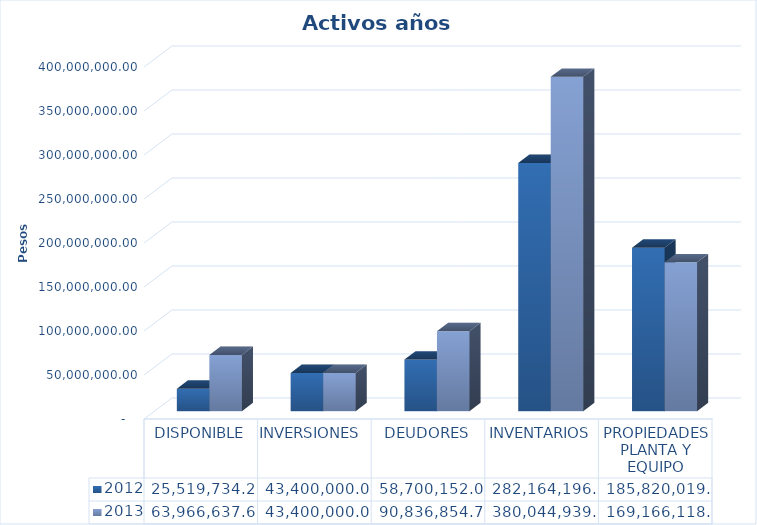
| Category | 2012 | 2013 |
|---|---|---|
| DISPONIBLE | 25519734.2 | 63966637.65 |
| INVERSIONES  | 43400000 | 43400000 |
| DEUDORES | 58700152 | 90836854.71 |
| INVENTARIOS | 282164196 | 380044939.7 |
| PROPIEDADES PLANTA Y EQUIPO | 185820019 | 169166118.1 |